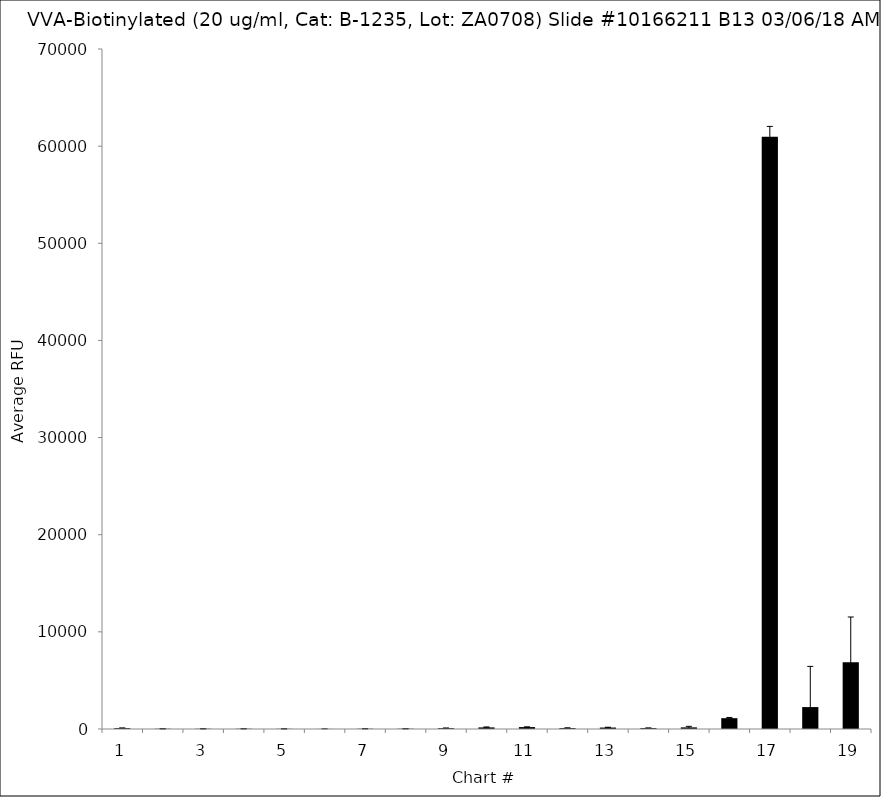
| Category | Series 0 |
|---|---|
| 1.0 | 88.25 |
| 2.0 | 24 |
| 3.0 | 24.25 |
| 4.0 | 24.75 |
| 5.0 | 18.25 |
| 6.0 | 8.75 |
| 7.0 | 27.75 |
| 8.0 | 26.75 |
| 9.0 | 83.75 |
| 10.0 | 164.5 |
| 11.0 | 197 |
| 12.0 | 92 |
| 13.0 | 149.75 |
| 14.0 | 89.75 |
| 15.0 | 167.25 |
| 16.0 | 1114.25 |
| 17.0 | 60959.5 |
| 18.0 | 2257.25 |
| 19.0 | 6858.5 |